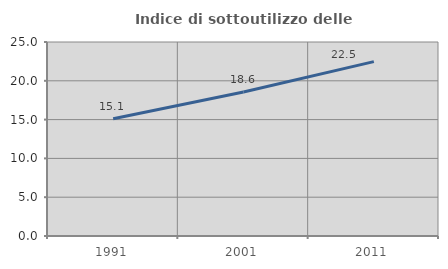
| Category | Indice di sottoutilizzo delle abitazioni  |
|---|---|
| 1991.0 | 15.117 |
| 2001.0 | 18.553 |
| 2011.0 | 22.468 |